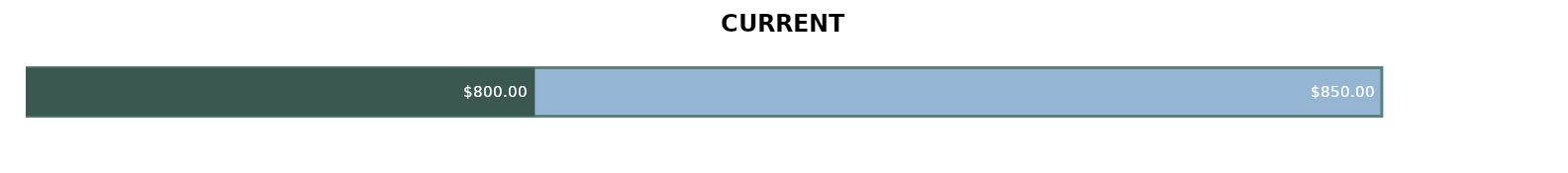
| Category | BUDGET | ACTUAL |
|---|---|---|
| 0 | 850 | 800 |